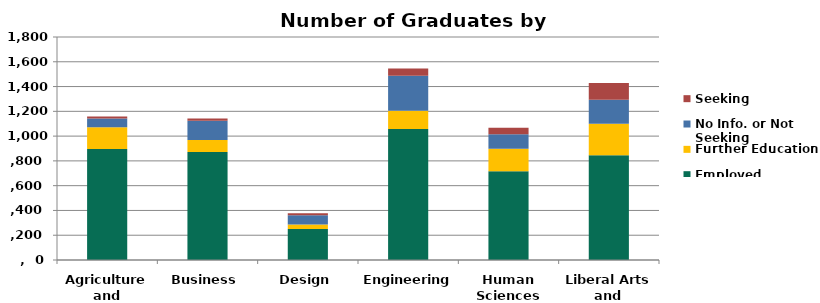
| Category | Employed | Further Education | No Info. or Not Seeking | Seeking |
|---|---|---|---|---|
| Agriculture and
Life Sciences | 895 | 176 | 71 | 17 |
| Business | 871 | 97 | 157 | 18 |
| Design | 251 | 35 | 76 | 15 |
| Engineering | 1058 | 147 | 282 | 59 |
| Human
Sciences | 716 | 182 | 117 | 52 |
| Liberal Arts and
Sciences | 845 | 254 | 194 | 135 |